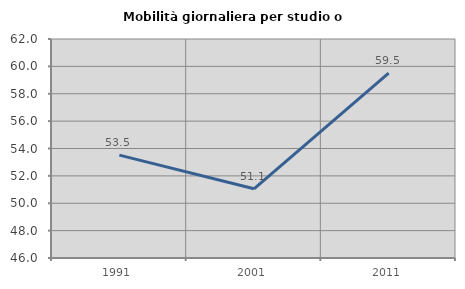
| Category | Mobilità giornaliera per studio o lavoro |
|---|---|
| 1991.0 | 53.514 |
| 2001.0 | 51.055 |
| 2011.0 | 59.504 |